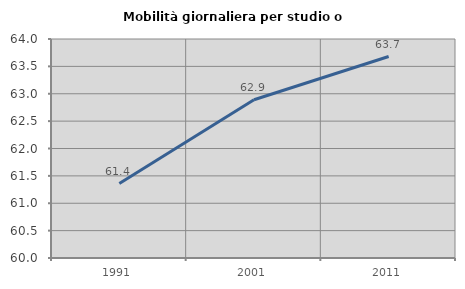
| Category | Mobilità giornaliera per studio o lavoro |
|---|---|
| 1991.0 | 61.36 |
| 2001.0 | 62.89 |
| 2011.0 | 63.68 |